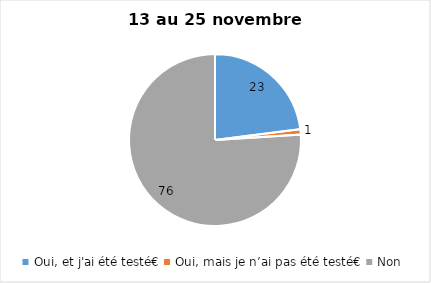
| Category | Series 0 |
|---|---|
| Oui, et j'ai été testé€ | 23 |
| Oui, mais je n’ai pas été testé€ | 1 |
| Non | 76 |